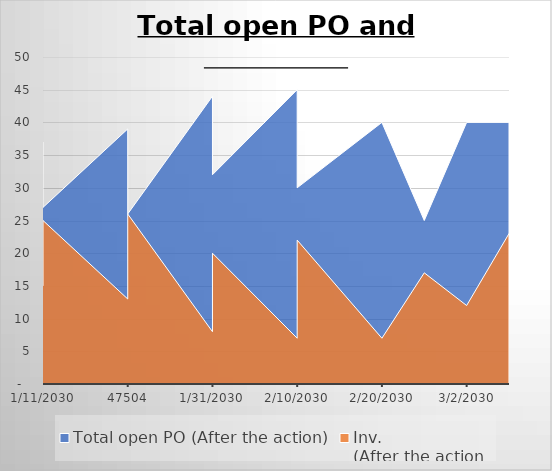
| Category | Total open PO (After the action) | Inv. 
(After the action |
|---|---|---|
| 1/11/30 | 37 | 15 |
| nan | 37 | 15 |
| 1/11/30 | 27 | 25 |
| nan | 27 | 13 |
| 1/21/30 | 39 | 13 |
| nan | 39 | 13 |
| 1/21/30 | 26 | 26 |
| nan | 26 | 8 |
| 1/31/30 | 44 | 8 |
| nan | 44 | 8 |
| 1/31/30 | 32 | 20 |
| nan | 32 | 7 |
| 2/10/30 | 45 | 7 |
| nan | 45 | 7 |
| 2/10/30 | 30 | 22 |
| nan | 30 | 12 |
| 2/20/30 | 40 | 7 |
| nan | 40 | 2 |
| 2/25/30 | 25 | 17 |
| nan | 25 | 12 |
| 3/2/30 | 40 | 12 |
| nan | 40 | 23 |
| 3/7/30 | 40 | 23 |